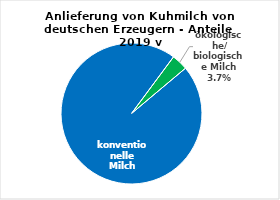
| Category | Series 0 |
|---|---|
| konventionelle Milch | 0.963 |
| ökologische/ biologische Milch | 0.037 |